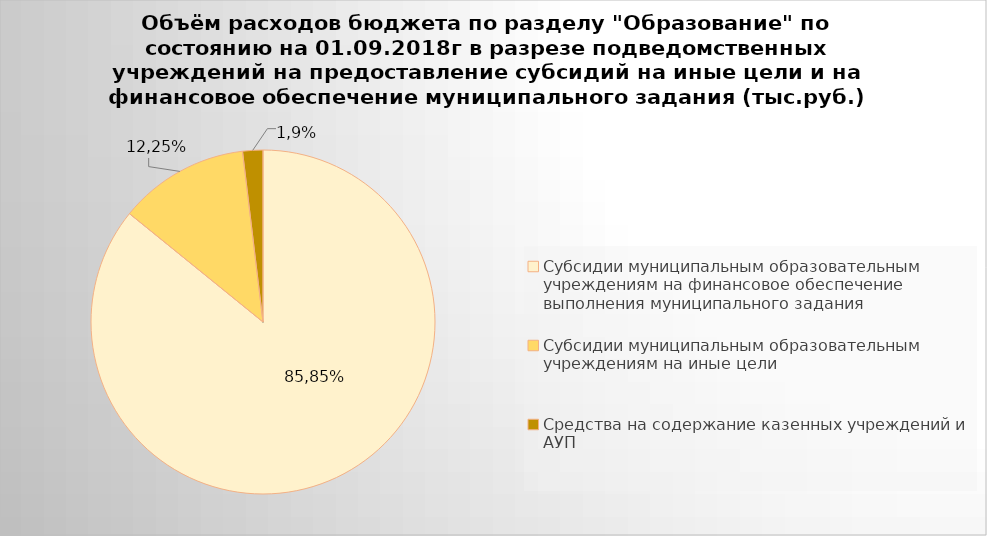
| Category | Series 0 |
|---|---|
| Субсидии муниципальным образовательным учреждениям на финансовое обеспечение выполнения муниципального задания | 4449129.1 |
| Субсидии муниципальным образовательным учреждениям на иные цели | 634826.11 |
| Средства на содержание казенных учреждений и АУП | 98559.79 |